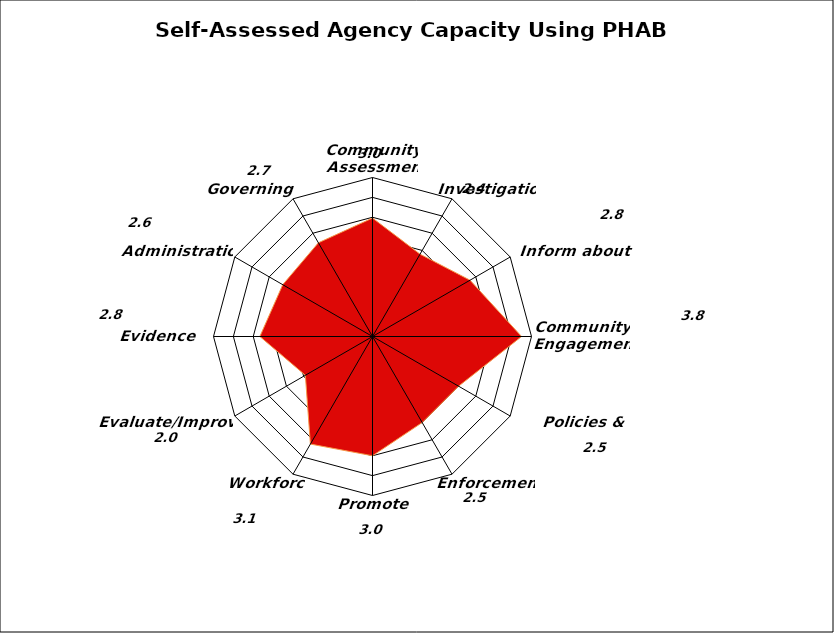
| Category | Series 0 |
|---|---|
| Community Assessment | 2.979 |
| Investigation | 2.392 |
| Inform about PH | 2.833 |
| Community Engagement | 3.75 |
| Policies & Planning | 2.5 |
| Enforcement | 2.5 |
| Promote Access | 3 |
| Workforce | 3.125 |
| Evaluate/Improve | 1.95 |
| Evidence Base | 2.833 |
| Administration | 2.607 |
| Governing Entity | 2.722 |